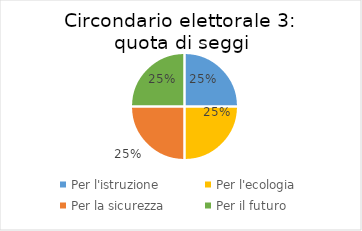
| Category | Quota voti |
|---|---|
| Per l'istruzione | 0.25 |
| Per l'ecologia | 0.25 |
| Per la sicurezza | 0.25 |
| Per il futuro | 0.25 |